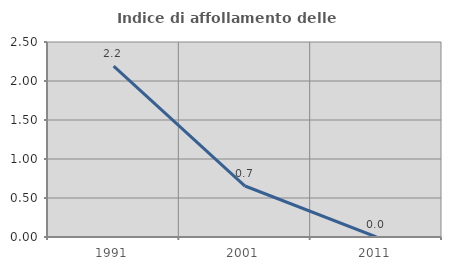
| Category | Indice di affollamento delle abitazioni  |
|---|---|
| 1991.0 | 2.19 |
| 2001.0 | 0.654 |
| 2011.0 | 0 |